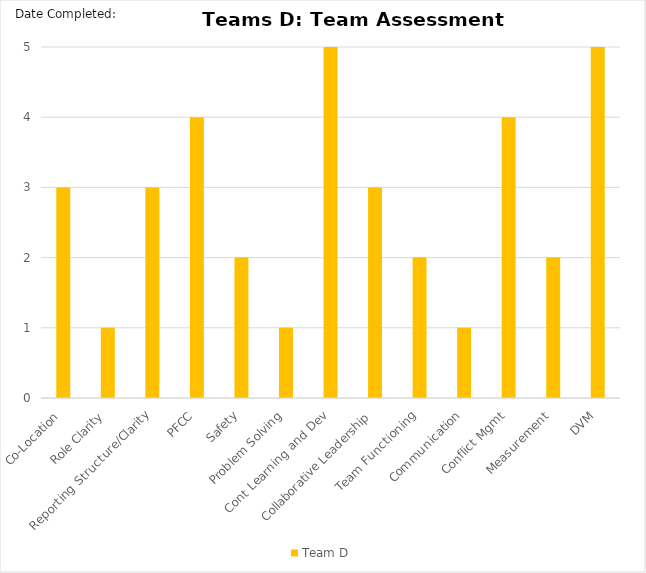
| Category | Team D |
|---|---|
| Co-Location | 3 |
| Role Clarity | 1 |
| Reporting Structure/Clarity | 3 |
| PFCC | 4 |
| Safety | 2 |
| Problem Solving | 1 |
| Cont Learning and Dev | 5 |
| Collaborative Leadership | 3 |
| Team Functioning | 2 |
| Communication | 1 |
| Conflict Mgmt | 4 |
| Measurement | 2 |
| DVM | 5 |